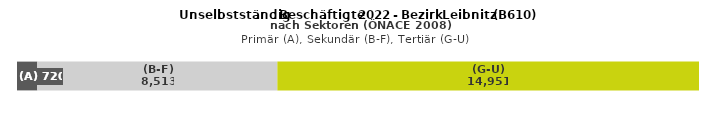
| Category | (A) | (B-F) | (G-U) |
|---|---|---|---|
| 0 | 720 | 8513 | 14951 |